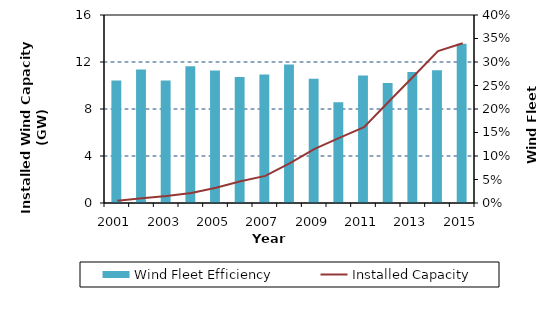
| Category | Wind Fleet Efficiency |
|---|---|
| 2001.0 | 0.261 |
| 2002.0 | 0.284 |
| 2003.0 | 0.261 |
| 2004.0 | 0.291 |
| 2005.0 | 0.282 |
| 2006.0 | 0.268 |
| 2007.0 | 0.273 |
| 2008.0 | 0.295 |
| 2009.0 | 0.264 |
| 2010.0 | 0.214 |
| 2011.0 | 0.271 |
| 2012.0 | 0.255 |
| 2013.0 | 0.279 |
| 2014.0 | 0.282 |
| 2015.0 | 0.339 |